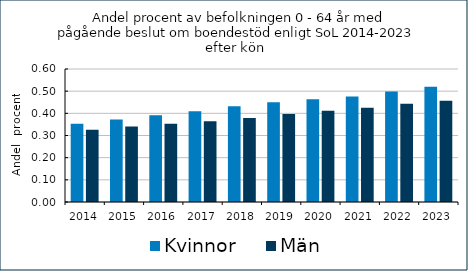
| Category | Kvinnor    | Män   |
|---|---|---|
| 2014.0 | 0.353 | 0.325 |
| 2015.0 | 0.372 | 0.341 |
| 2016.0 | 0.391 | 0.353 |
| 2017.0 | 0.409 | 0.364 |
| 2018.0 | 0.431 | 0.379 |
| 2019.0 | 0.45 | 0.397 |
| 2020.0 | 0.463 | 0.412 |
| 2021.0 | 0.476 | 0.425 |
| 2022.0 | 0.498 | 0.444 |
| 2023.0 | 0.519 | 0.457 |